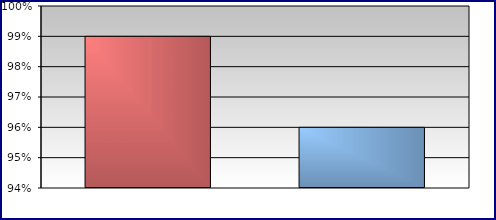
| Category | Series 0 | Series 1 | Series 2 | Series 3 |
|---|---|---|---|---|
| 0 | 0.99 |  |  |  |
| 1 | 0.96 |  |  |  |